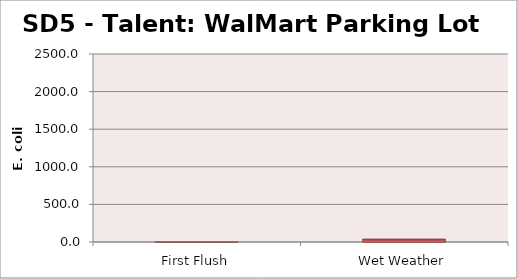
| Category | E. coli MPN - |
|---|---|
| First Flush | 3 |
| Wet Weather | 38.4 |